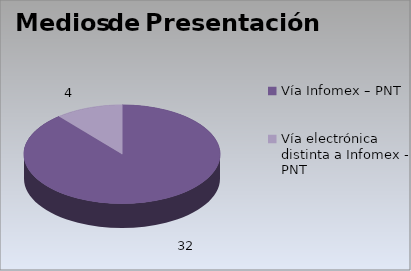
| Category | Series 0 |
|---|---|
| Vía Infomex – PNT | 32 |
| Vía electrónica distinta a Infomex - PNT | 4 |